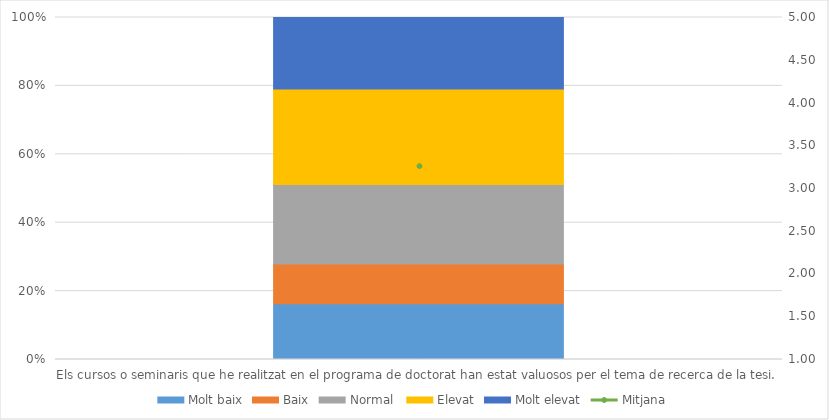
| Category | Molt baix | Baix | Normal  | Elevat | Molt elevat |
|---|---|---|---|---|---|
| Els cursos o seminaris que he realitzat en el programa de doctorat han estat valuosos per el tema de recerca de la tesi. | 7 | 5 | 10 | 12 | 9 |